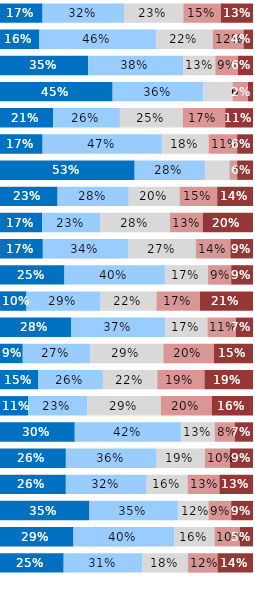
| Category | Almost Always or Always | Usually | Occasionally | Seldom | Never or Almost Never |
|---|---|---|---|---|---|
| Q1 | 0.168 | 0.322 | 0.234 | 0.148 | 0.127 |
| Q2 | 0.156 | 0.462 | 0.224 | 0.122 | 0.038 |
| Q3 | 0.348 | 0.375 | 0.127 | 0.09 | 0.059 |
| Q4 | 0.445 | 0.359 | 0.115 | 0.061 | 0.02 |
| Q5 | 0.211 | 0.263 | 0.249 | 0.168 | 0.11 |
| Q6 | 0.168 | 0.471 | 0.185 | 0.113 | 0.063 |
| Q7 | 0.532 | 0.278 | 0.097 | 0.03 | 0.063 |
| Q8 | 0.228 | 0.281 | 0.201 | 0.149 | 0.142 |
| Q9 | 0.167 | 0.229 | 0.276 | 0.129 | 0.199 |
| Q10 | 0.169 | 0.339 | 0.266 | 0.137 | 0.089 |
| Q11 | 0.255 | 0.397 | 0.171 | 0.092 | 0.086 |
| Q12 | 0.105 | 0.293 | 0.221 | 0.172 | 0.21 |
| Q13 | 0.282 | 0.371 | 0.167 | 0.113 | 0.067 |
| Q14 | 0.09 | 0.268 | 0.288 | 0.2 | 0.155 |
| Q15 | 0.151 | 0.256 | 0.215 | 0.186 | 0.192 |
| Q16 | 0.112 | 0.234 | 0.289 | 0.201 | 0.163 |
| Q17 | 0.295 | 0.422 | 0.132 | 0.079 | 0.072 |
| Q18 | 0.26 | 0.359 | 0.19 | 0.099 | 0.092 |
| Q19 | 0.26 | 0.32 | 0.162 | 0.126 | 0.133 |
| Q20 | 0.354 | 0.352 | 0.118 | 0.09 | 0.086 |
| Q21 | 0.29 | 0.398 | 0.159 | 0.1 | 0.052 |
| Q22 | 0.252 | 0.311 | 0.18 | 0.117 | 0.14 |